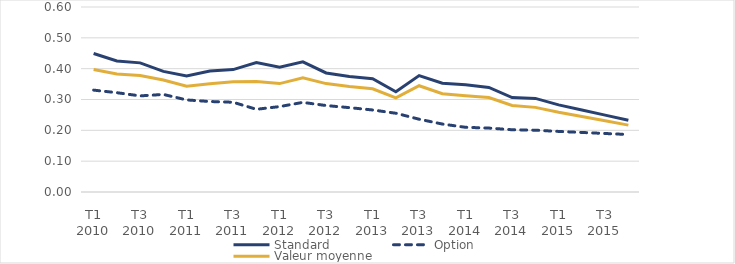
| Category | Standard | Option | Valeur moyenne |
|---|---|---|---|
| T1 2010 | 0.449 | 0.33 | 0.397 |
| T2 2010 | 0.425 | 0.322 | 0.382 |
| T3 2010 | 0.419 | 0.312 | 0.378 |
| T4 2010 | 0.391 | 0.316 | 0.363 |
| T1 2011 | 0.376 | 0.299 | 0.343 |
| T2 2011 | 0.392 | 0.293 | 0.351 |
| T3 2011 | 0.397 | 0.291 | 0.357 |
| T4 2011 | 0.42 | 0.268 | 0.358 |
| T1 2012 | 0.405 | 0.277 | 0.352 |
| T2 2012 | 0.422 | 0.291 | 0.37 |
| T3 2012 | 0.386 | 0.28 | 0.352 |
| T4 2012 | 0.375 | 0.274 | 0.342 |
| T1 2013 | 0.367 | 0.266 | 0.335 |
| T2 2013 | 0.325 | 0.255 | 0.305 |
| T3 2013 | 0.378 | 0.236 | 0.345 |
| T4 2013 | 0.353 | 0.22 | 0.319 |
| T1 2014 | 0.348 | 0.21 | 0.312 |
| T2 2014 | 0.339 | 0.207 | 0.306 |
| T3 2014 | 0.306 | 0.202 | 0.281 |
| T4 2014 | 0.304 | 0.2 | 0.274 |
| T1 2015 | 0.283 | 0.196 | 0.259 |
| T2 2015 | 0.266 | 0.193 | 0.245 |
| T3 2015 | 0.249 | 0.19 | 0.231 |
| T4 2015 | 0.233 | 0.186 | 0.217 |